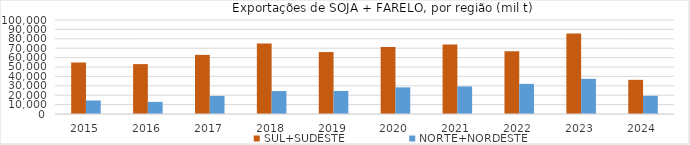
| Category | SUL+SUDESTE | NORTE+NORDESTE |
|---|---|---|
| 2015.0 | 54790.313 | 14360.514 |
| 2016.0 | 53073.46 | 12905.982 |
| 2017.0 | 62880.602 | 19267.201 |
| 2018.0 | 74935.61 | 24412.927 |
| 2019.0 | 65869.862 | 24521.801 |
| 2020.0 | 71161.424 | 28355.916 |
| 2021.0 | 73845.972 | 29295.579 |
| 2022.0 | 66760.174 | 32051.109 |
| 2023.0 | 85765.384 | 37406.056 |
| 2024.0 | 36349.524 | 19384.551 |